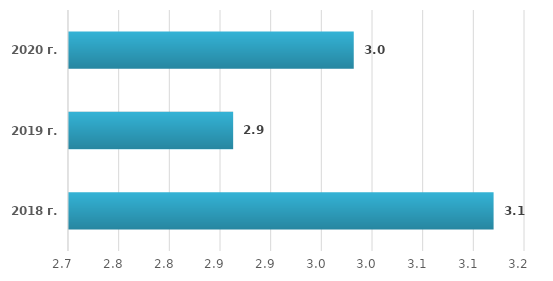
| Category | Series 0 |
|---|---|
| 2018 г. | 3.119 |
| 2019 г. | 2.862 |
| 2020 г. | 2.981 |